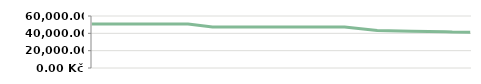
| Category | ČTVRTLETÍ   |
|---|---|
| 2013-04-23 | 50800 |
| 2013-04-25 | 50800 |
| 2013-05-07 | 50800 |
| 2013-05-14 | 50800 |
| 2013-05-14 | 50800 |
| 2013-05-29 | 50800 |
| 2013-06-10 | 50800 |
| 2013-06-21 | 50800 |
| 2013-07-06 | 47400 |
| 2013-08-05 | 47400 |
| 2013-08-19 | 47400 |
| 2013-09-04 | 47400 |
| 2013-09-20 | 47400 |
| 2013-09-25 | 47400 |
| 2013-10-15 | 43258.14 |
| 2013-11-05 | 42312.903 |
| 2013-11-26 | 41811.111 |
| 2013-11-30 | 41500 |
| 2013-12-11 | 41288.235 |